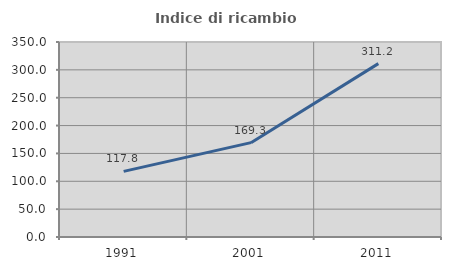
| Category | Indice di ricambio occupazionale  |
|---|---|
| 1991.0 | 117.826 |
| 2001.0 | 169.328 |
| 2011.0 | 311.169 |